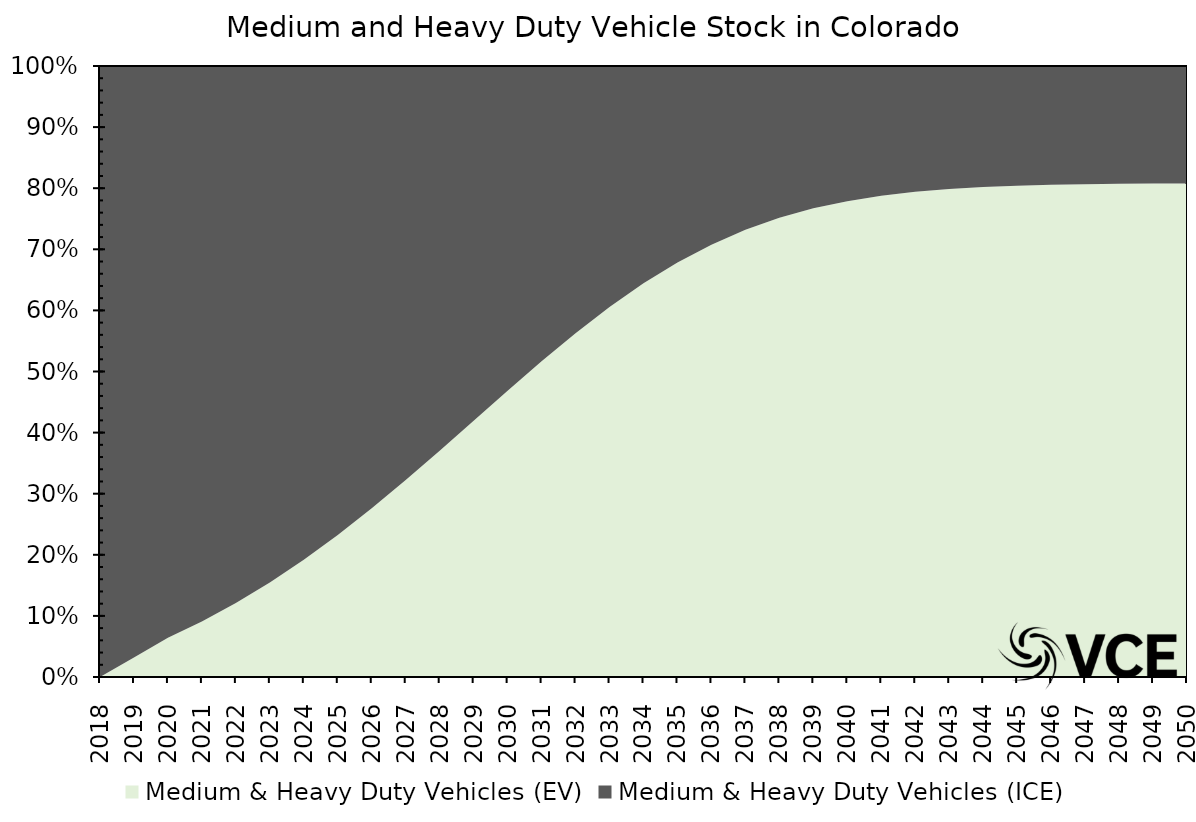
| Category | Medium & Heavy Duty Vehicles (EV) | Medium & Heavy Duty Vehicles (ICE) |
|---|---|---|
| 2018.0 | 0 | 1 |
| 2019.0 | 0.032 | 0.968 |
| 2020.0 | 0.064 | 0.936 |
| 2021.0 | 0.091 | 0.909 |
| 2022.0 | 0.121 | 0.879 |
| 2023.0 | 0.155 | 0.845 |
| 2024.0 | 0.192 | 0.808 |
| 2025.0 | 0.232 | 0.768 |
| 2026.0 | 0.276 | 0.724 |
| 2027.0 | 0.322 | 0.678 |
| 2028.0 | 0.37 | 0.63 |
| 2029.0 | 0.419 | 0.581 |
| 2030.0 | 0.469 | 0.531 |
| 2031.0 | 0.517 | 0.483 |
| 2032.0 | 0.563 | 0.437 |
| 2033.0 | 0.606 | 0.394 |
| 2034.0 | 0.644 | 0.356 |
| 2035.0 | 0.678 | 0.322 |
| 2036.0 | 0.708 | 0.292 |
| 2037.0 | 0.732 | 0.268 |
| 2038.0 | 0.752 | 0.248 |
| 2039.0 | 0.767 | 0.233 |
| 2040.0 | 0.779 | 0.221 |
| 2041.0 | 0.788 | 0.212 |
| 2042.0 | 0.794 | 0.206 |
| 2043.0 | 0.799 | 0.201 |
| 2044.0 | 0.802 | 0.198 |
| 2045.0 | 0.804 | 0.196 |
| 2046.0 | 0.805 | 0.195 |
| 2047.0 | 0.806 | 0.194 |
| 2048.0 | 0.807 | 0.193 |
| 2049.0 | 0.808 | 0.192 |
| 2050.0 | 0.808 | 0.192 |